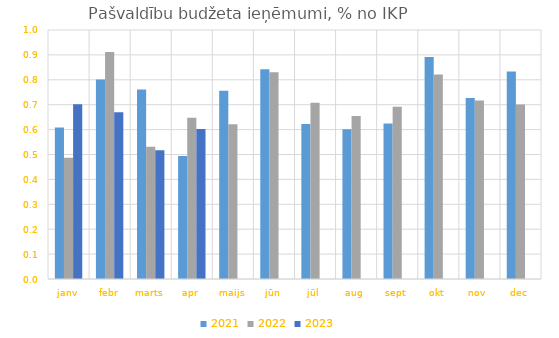
| Category | 2021 | 2022 | 2023 |
|---|---|---|---|
| janv | 0.609 | 0.487 | 0.702 |
| febr | 0.801 | 0.911 | 0.67 |
| marts | 0.761 | 0.531 | 0.517 |
| apr | 0.494 | 0.648 | 0.602 |
| maijs | 0.756 | 0.621 | 0 |
| jūn | 0.843 | 0.83 | 0 |
| jūl | 0.622 | 0.708 | 0 |
| aug | 0.601 | 0.654 | 0 |
| sept | 0.624 | 0.692 | 0 |
| okt | 0.891 | 0.822 | 0 |
| nov | 0.727 | 0.717 | 0 |
| dec | 0.833 | 0.701 | 0 |